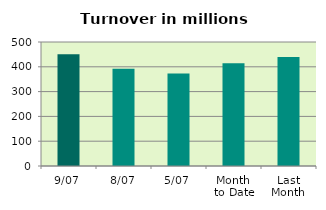
| Category | Series 0 |
|---|---|
| 9/07 | 450.12 |
| 8/07 | 392.129 |
| 5/07 | 373.462 |
| Month 
to Date | 414.789 |
| Last
Month | 439.695 |